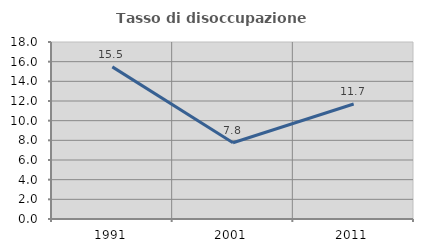
| Category | Tasso di disoccupazione giovanile  |
|---|---|
| 1991.0 | 15.468 |
| 2001.0 | 7.759 |
| 2011.0 | 11.694 |